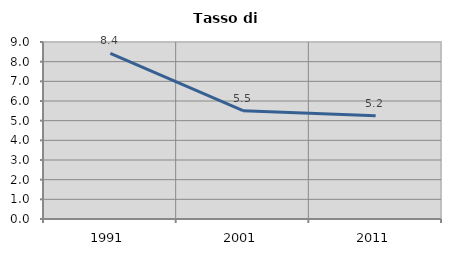
| Category | Tasso di disoccupazione   |
|---|---|
| 1991.0 | 8.418 |
| 2001.0 | 5.509 |
| 2011.0 | 5.247 |